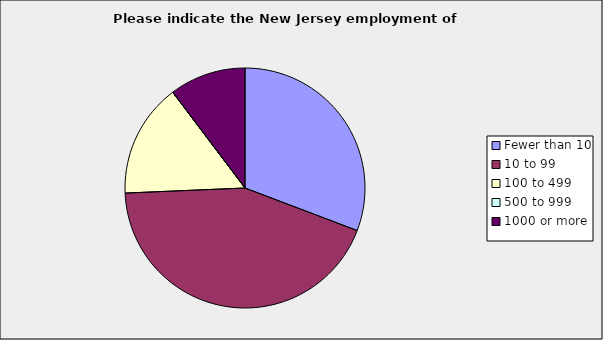
| Category | Series 0 |
|---|---|
| Fewer than 10 | 0.308 |
| 10 to 99 | 0.436 |
| 100 to 499 | 0.154 |
| 500 to 999 | 0 |
| 1000 or more | 0.103 |